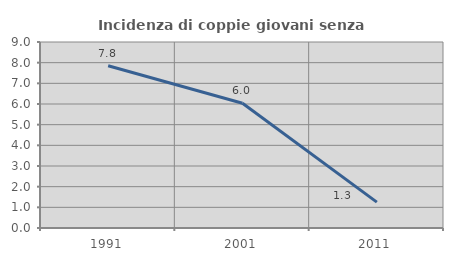
| Category | Incidenza di coppie giovani senza figli |
|---|---|
| 1991.0 | 7.848 |
| 2001.0 | 6.039 |
| 2011.0 | 1.25 |